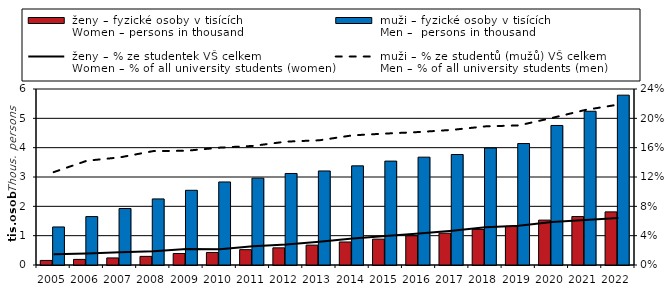
| Category |  ženy – fyzické osoby v tisících
 Women – persons in thousand |  muži – fyzické osoby v tisících
 Men –  persons in thousand |
|---|---|---|
| 2005.0 | 0.156 | 1.297 |
| 2006.0 | 0.191 | 1.651 |
| 2007.0 | 0.241 | 1.926 |
| 2008.0 | 0.294 | 2.253 |
| 2009.0 | 0.392 | 2.547 |
| 2010.0 | 0.427 | 2.831 |
| 2011.0 | 0.523 | 2.961 |
| 2012.0 | 0.585 | 3.12 |
| 2013.0 | 0.678 | 3.206 |
| 2014.0 | 0.785 | 3.38 |
| 2015.0 | 0.882 | 3.542 |
| 2016.0 | 0.996 | 3.676 |
| 2017.0 | 1.085 | 3.767 |
| 2018.0 | 1.212 | 3.988 |
| 2019.0 | 1.317 | 4.141 |
| 2020.0 | 1.53 | 4.757 |
| 2021.0 | 1.653 | 5.241 |
| 2022.0 | 1.811 | 5.79 |